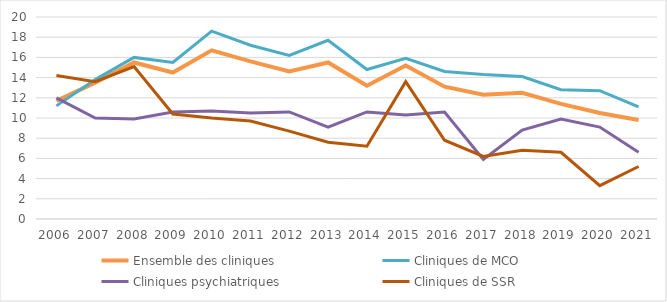
| Category | Ensemble des cliniques | Cliniques de MCO | Cliniques psychiatriques | Cliniques de SSR |
|---|---|---|---|---|
| 2006 | 11.7 | 11.2 | 12 | 14.2 |
| 2007 | 13.5 | 13.8 | 10 | 13.6 |
| 2008 | 15.5 | 16 | 9.9 | 15.1 |
| 2009 | 14.5 | 15.5 | 10.6 | 10.4 |
| 2010 | 16.7 | 18.6 | 10.7 | 10 |
| 2011 | 15.6 | 17.2 | 10.5 | 9.7 |
| 2012 | 14.6 | 16.2 | 10.6 | 8.7 |
| 2013 | 15.5 | 17.7 | 9.1 | 7.6 |
| 2014 | 13.2 | 14.8 | 10.6 | 7.2 |
| 2015 | 15.2 | 15.9 | 10.3 | 13.6 |
| 2016 | 13.1 | 14.6 | 10.6 | 7.8 |
| 2017 | 12.3 | 14.3 | 5.9 | 6.2 |
| 2018 | 12.5 | 14.1 | 8.8 | 6.8 |
| 2019 | 11.4 | 12.8 | 9.9 | 6.6 |
| 2020 | 10.5 | 12.7 | 9.1 | 3.3 |
| 2021 | 9.8 | 11.1 | 6.6 | 5.2 |